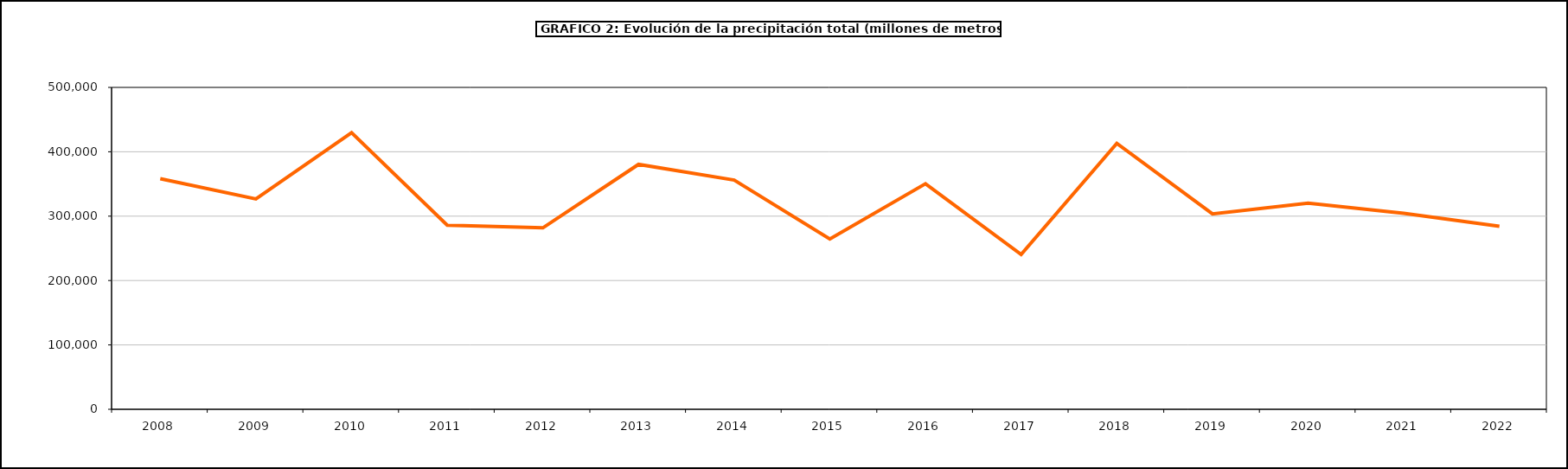
| Category | Series 0 |
|---|---|
| 2008.0 | 358273.25 |
| 2009.0 | 326778 |
| 2010.0 | 429768 |
| 2011.0 | 285948 |
| 2012.0 | 281817 |
| 2013.0 | 380420 |
| 2014.0 | 356097 |
| 2015.0 | 264511.7 |
| 2016.0 | 350442.2 |
| 2017.0 | 240463.8 |
| 2018.0 | 413003.9 |
| 2019.0 | 303475.4 |
| 2020.0 | 320234.1 |
| 2021.0 | 304476.4 |
| 2022.0 | 284202.4 |